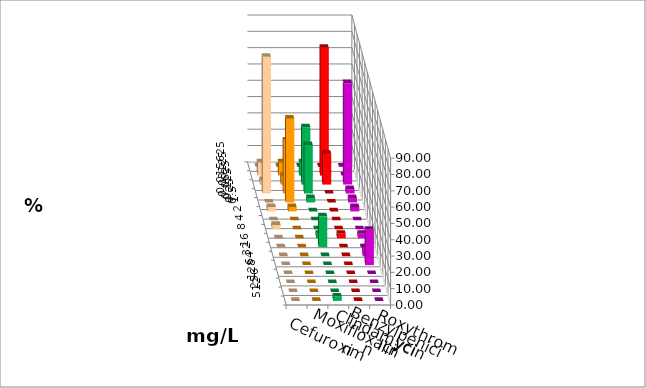
| Category | Cefuroxim | Moxifloxacin | Clindamycin | Benzylpenicillin | Roxythromycin |
|---|---|---|---|---|---|
| 0.015625 | 0 | 0 | 0 | 0 | 0 |
| 0.03125 | 8.108 | 8.108 | 8.108 | 78.378 | 0 |
| 0.0625 | 2.703 | 5.405 | 35.135 | 18.919 | 62.162 |
| 0.125 | 83.784 | 32.432 | 29.73 | 0 | 2.703 |
| 0.25 | 0 | 51.351 | 2.703 | 0 | 2.703 |
| 0.5 | 2.703 | 2.703 | 0 | 0 | 2.703 |
| 1.0 | 0 | 0 | 0 | 0 | 0 |
| 2.0 | 2.703 | 0 | 0 | 0 | 0 |
| 4.0 | 0 | 0 | 2.703 | 2.703 | 2.703 |
| 8.0 | 0 | 0 | 18.919 | 0 | 0 |
| 16.0 | 0 | 0 | 0 | 0 | 5.405 |
| 32.0 | 0 | 0 | 0 | 0 | 21.622 |
| 64.0 | 0 | 0 | 0 | 0 | 0 |
| 128.0 | 0 | 0 | 0 | 0 | 0 |
| 256.0 | 0 | 0 | 0 | 0 | 0 |
| 512.0 | 0 | 0 | 2.703 | 0 | 0 |